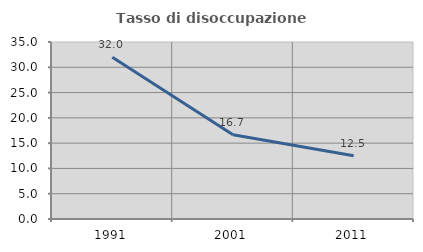
| Category | Tasso di disoccupazione giovanile  |
|---|---|
| 1991.0 | 32 |
| 2001.0 | 16.667 |
| 2011.0 | 12.5 |